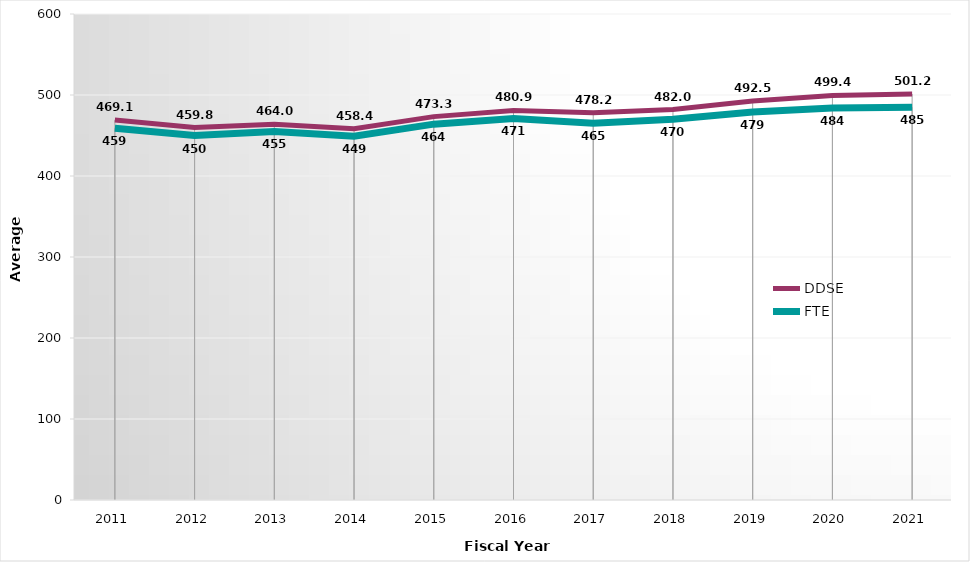
| Category | DDSE | FTE |
|---|---|---|
| 2011.0 | 469.1 | 459 |
| 2012.0 | 459.8 | 450 |
| 2013.0 | 464 | 455 |
| 2014.0 | 458.4 | 449 |
| 2015.0 | 473.3 | 464 |
| 2016.0 | 480.9 | 471 |
| 2017.0 | 478.2 | 465 |
| 2018.0 | 482 | 470 |
| 2019.0 | 492.5 | 479 |
| 2020.0 | 499.4 | 484 |
| 2021.0 | 501.2 | 485 |